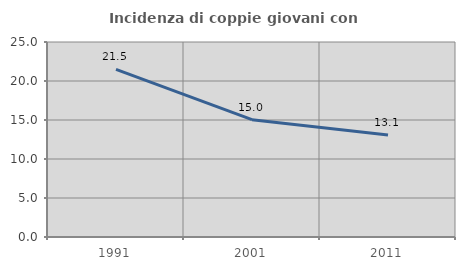
| Category | Incidenza di coppie giovani con figli |
|---|---|
| 1991.0 | 21.483 |
| 2001.0 | 15.045 |
| 2011.0 | 13.073 |